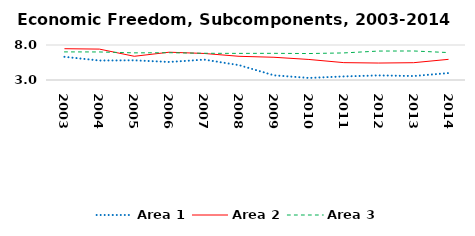
| Category | Area 1 | Area 2 | Area 3 |
|---|---|---|---|
| 2003.0 | 6.314 | 7.47 | 7.015 |
| 2004.0 | 5.782 | 7.415 | 7.006 |
| 2005.0 | 5.812 | 6.386 | 6.876 |
| 2006.0 | 5.576 | 6.969 | 6.899 |
| 2007.0 | 5.911 | 6.792 | 6.817 |
| 2008.0 | 5.122 | 6.385 | 6.801 |
| 2009.0 | 3.667 | 6.247 | 6.811 |
| 2010.0 | 3.296 | 5.934 | 6.78 |
| 2011.0 | 3.513 | 5.481 | 6.867 |
| 2012.0 | 3.654 | 5.422 | 7.134 |
| 2013.0 | 3.565 | 5.473 | 7.145 |
| 2014.0 | 3.994 | 5.951 | 6.918 |